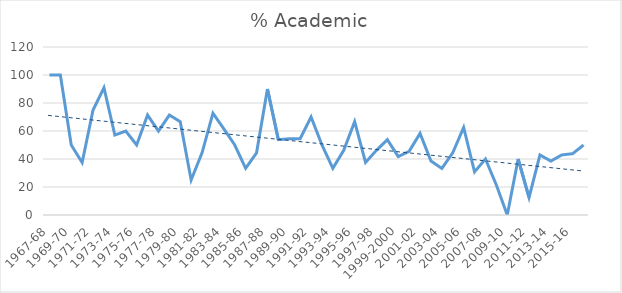
| Category | % Academic |
|---|---|
| 1967-68 | 100 |
| 1968-69 | 100 |
| 1969-70 | 50 |
| 1970-71 | 37.5 |
| 1971-72 | 75 |
| 1972-73 | 90.9 |
| 1973-74 | 57.1 |
| 1974-75 | 60 |
| 1975-76 | 50 |
| 1976-77 | 71.4 |
| 1977-78 | 60 |
| 1978-79 | 71.4 |
| 1979-80 | 66.7 |
| 1980-81 | 25 |
| 1981-82 | 44.4 |
| 1982-83 | 72.7 |
| 1983-84 | 61.5 |
| 1984-85 | 50 |
| 1985-86 | 33.3 |
| 1986-87 | 44.4 |
| 1987-88 | 90 |
| 1988-89 | 53.8 |
| 1989-90 | 54.5 |
| 1990-91 | 54.5 |
| 1991-92 | 70 |
| 1992-93 | 50 |
| 1993-94 | 33.3 |
| 1994-95 | 46.2 |
| 1995-96 | 66.7 |
| 1996-97 | 37.5 |
| 1997-98 | 46.2 |
| 1998-99 | 53.8 |
| 1999-2000 | 41.7 |
| 2000-01 | 45.5 |
| 2001-02 | 58.3 |
| 2002-03 | 38.5 |
| 2003-04 | 33.3 |
| 2004-05 | 44.4 |
| 2005-06 | 62.5 |
| 2006-07 | 30.8 |
| 2007-08 | 40 |
| 2008-09 | 21.4 |
| 2009-10 | 0 |
| 2010-11 | 40 |
| 2011-12 | 12.5 |
| 2012-13 | 42.9 |
| 2013-14 | 38.5 |
| 2014-15 | 42.9 |
| 2015-16 | 43.8 |
| 2016-17 | 50 |